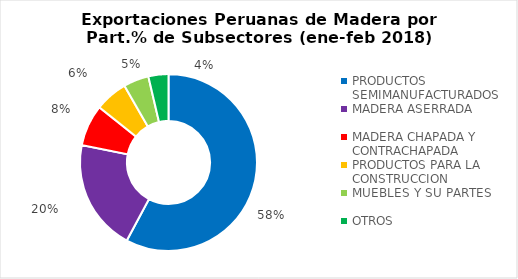
| Category | Part.% 2018 |
|---|---|
| PRODUCTOS SEMIMANUFACTURADOS | 0.578 |
| MADERA ASERRADA | 0.203 |
| MADERA CHAPADA Y CONTRACHAPADA | 0.076 |
| PRODUCTOS PARA LA CONSTRUCCION | 0.06 |
| MUEBLES Y SU PARTES | 0.046 |
| OTROS | 0.037 |